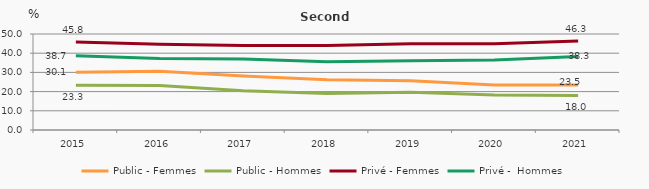
| Category | Public - Femmes | Public - Hommes | Privé - Femmes | Privé -  Hommes |
|---|---|---|---|---|
| 2015.0 | 30.1 | 23.3 | 45.8 | 38.7 |
| 2016.0 | 30.6 | 23.2 | 44.6 | 37.2 |
| 2017.0 | 28.1 | 20.5 | 44 | 37 |
| 2018.0 | 26.2 | 19 | 44 | 35.6 |
| 2019.0 | 25.6 | 19.7 | 44.9 | 36.1 |
| 2020.0 | 23.4 | 18.2 | 44.9 | 36.5 |
| 2021.0 | 23.5 | 18 | 46.3 | 38.3 |